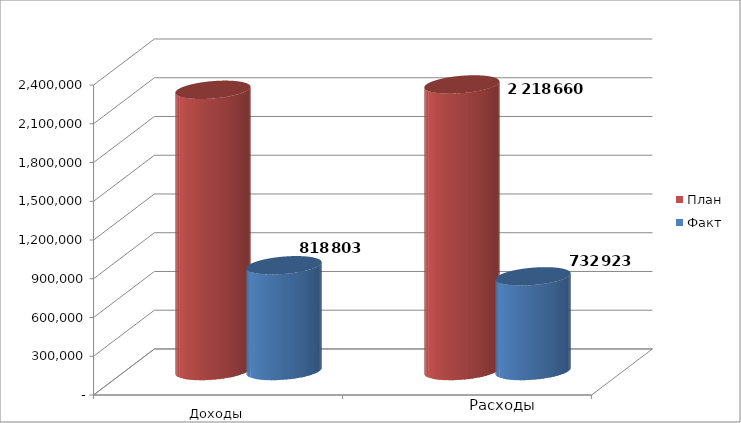
| Category | План | Факт |
|---|---|---|
| 0 | 2177285 | 818803 |
| 1 | 2218660 | 732923 |